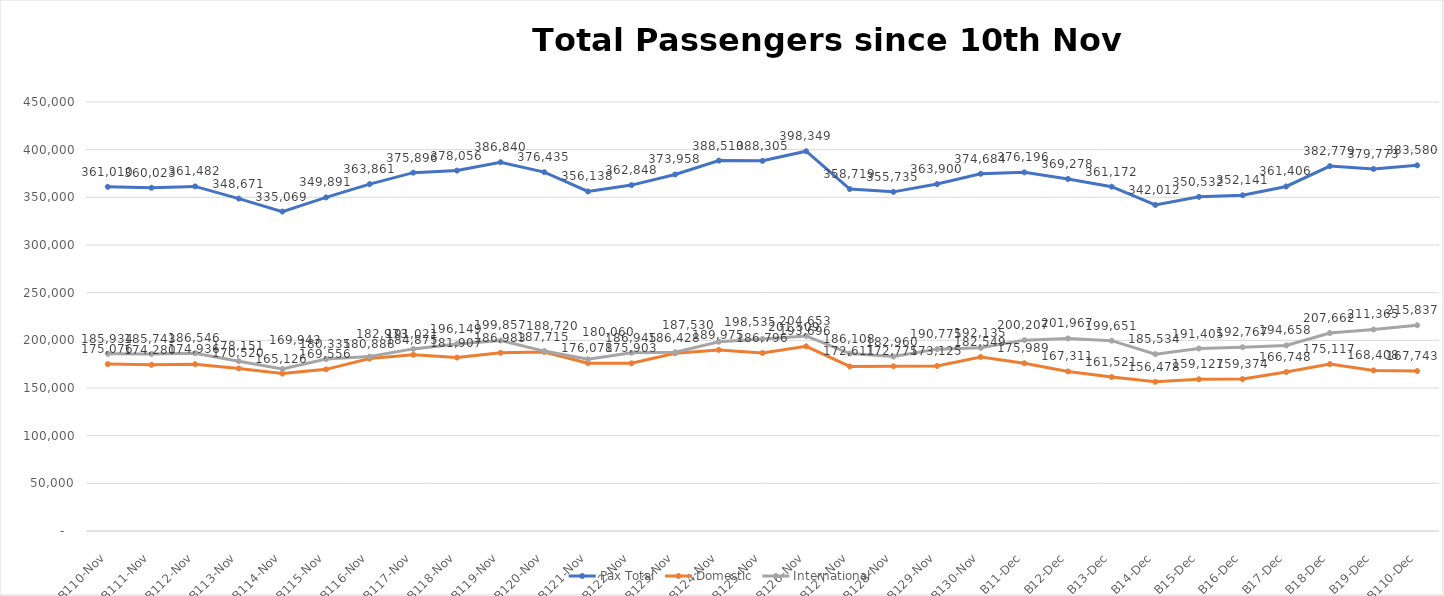
| Category | Pax Total | Domestic | International |
|---|---|---|---|
| 2023-11-10 | 361010 | 175076 | 185934 |
| 2023-11-11 | 360023 | 174280 | 185743 |
| 2023-11-12 | 361482 | 174936 | 186546 |
| 2023-11-13 | 348671 | 170520 | 178151 |
| 2023-11-14 | 335069 | 165126 | 169943 |
| 2023-11-15 | 349891 | 169556 | 180335 |
| 2023-11-16 | 363861 | 180888 | 182973 |
| 2023-11-17 | 375896 | 184875 | 191021 |
| 2023-11-18 | 378056 | 181907 | 196149 |
| 2023-11-19 | 386840 | 186983 | 199857 |
| 2023-11-20 | 376435 | 187715 | 188720 |
| 2023-11-21 | 356138 | 176078 | 180060 |
| 2023-11-22 | 362848 | 175903 | 186945 |
| 2023-11-23 | 373958 | 186428 | 187530 |
| 2023-11-24 | 388510 | 189975 | 198535 |
| 2023-11-25 | 388305 | 186796 | 201509 |
| 2023-11-26 | 398349 | 193696 | 204653 |
| 2023-11-27 | 358719 | 172611 | 186108 |
| 2023-11-28 | 355735 | 172775 | 182960 |
| 2023-11-29 | 363900 | 173125 | 190775 |
| 2023-11-30 | 374684 | 182549 | 192135 |
| 2023-12-01 | 376196 | 175989 | 200207 |
| 2023-12-02 | 369278 | 167311 | 201967 |
| 2023-12-03 | 361172 | 161521 | 199651 |
| 2023-12-04 | 342012 | 156478 | 185534 |
| 2023-12-05 | 350532 | 159127 | 191405 |
| 2023-12-06 | 352141 | 159374 | 192767 |
| 2023-12-07 | 361406 | 166748 | 194658 |
| 2023-12-08 | 382779 | 175117 | 207662 |
| 2023-12-09 | 379773 | 168408 | 211365 |
| 2023-12-10 | 383580 | 167743 | 215837 |